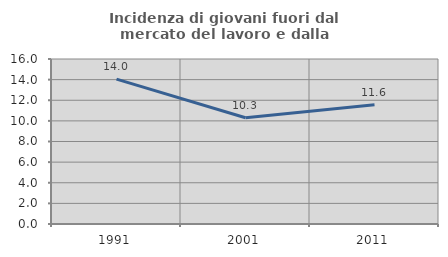
| Category | Incidenza di giovani fuori dal mercato del lavoro e dalla formazione  |
|---|---|
| 1991.0 | 14.05 |
| 2001.0 | 10.305 |
| 2011.0 | 11.558 |